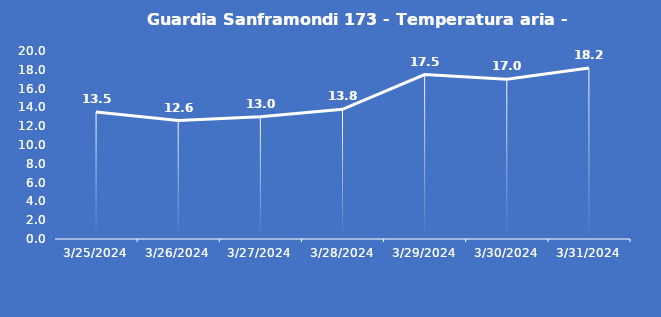
| Category | Guardia Sanframondi 173 - Temperatura aria - Grezzo (°C) |
|---|---|
| 3/25/24 | 13.5 |
| 3/26/24 | 12.6 |
| 3/27/24 | 13 |
| 3/28/24 | 13.8 |
| 3/29/24 | 17.5 |
| 3/30/24 | 17 |
| 3/31/24 | 18.2 |